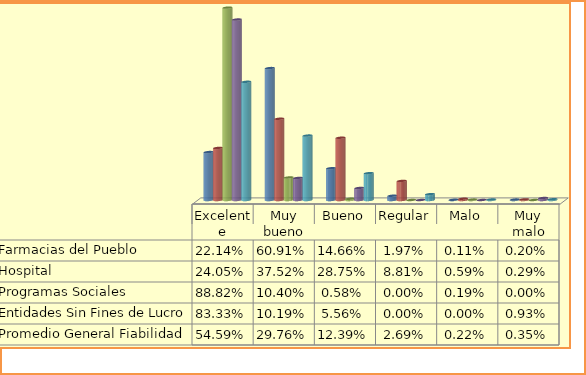
| Category | Farmacias del Pueblo | Hospital  | Programas Sociales | Entidades Sin Fines de Lucro | Promedio General Fiabilidad |
|---|---|---|---|---|---|
| Excelente | 0.221 | 0.24 | 0.888 | 0.833 | 0.546 |
| Muy bueno | 0.609 | 0.375 | 0.104 | 0.102 | 0.298 |
| Bueno | 0.147 | 0.287 | 0.006 | 0.056 | 0.124 |
| Regular | 0.02 | 0.088 | 0 | 0 | 0.027 |
| Malo | 0.001 | 0.006 | 0.002 | 0 | 0.002 |
| Muy malo | 0.002 | 0.003 | 0 | 0.009 | 0.004 |